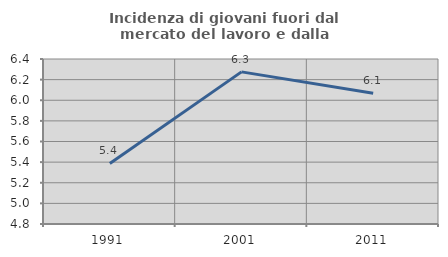
| Category | Incidenza di giovani fuori dal mercato del lavoro e dalla formazione  |
|---|---|
| 1991.0 | 5.387 |
| 2001.0 | 6.275 |
| 2011.0 | 6.068 |